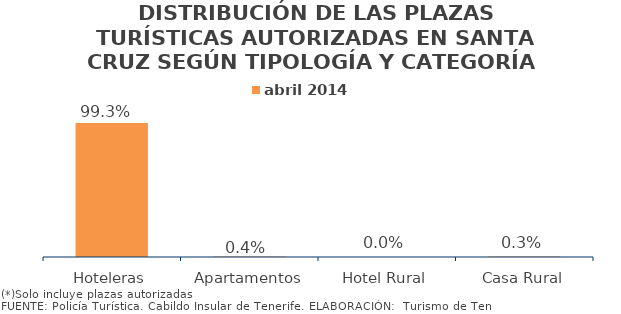
| Category | abril 2014 |
|---|---|
| Hoteleras | 0.993 |
| Apartamentos | 0.004 |
| Hotel Rural | 0 |
| Casa Rural | 0.003 |